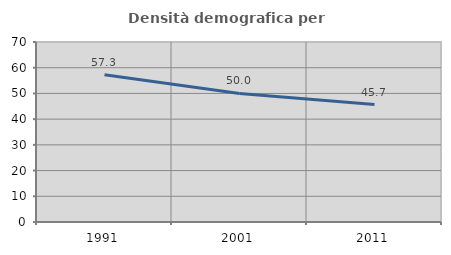
| Category | Densità demografica |
|---|---|
| 1991.0 | 57.277 |
| 2001.0 | 50.013 |
| 2011.0 | 45.655 |